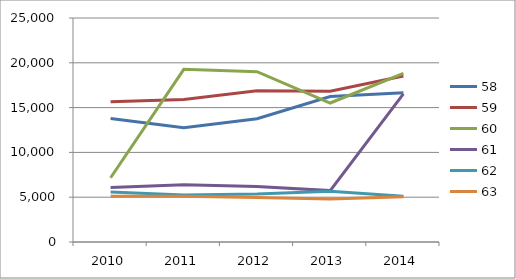
| Category | 58 | 59 | 60 | 61 | 62 | 63 |
|---|---|---|---|---|---|---|
| 2010.0 | 13791.786 | 15642.857 | 7169.643 | 6074.643 | 5579.286 | 5110 |
| 2011.0 | 12748.929 | 15903.571 | 19266.786 | 6387.5 | 5240.357 | 5110 |
| 2012.0 | 13765.714 | 16868.214 | 19006.071 | 6205 | 5344.643 | 4953.571 |
| 2013.0 | 16242.5 | 16816.071 | 15512.5 | 5735.714 | 5657.5 | 4797.143 |
| 2014.0 | 16659.643 | 18536.786 | 18823.571 | 16529.286 | 5110 | 5057.857 |